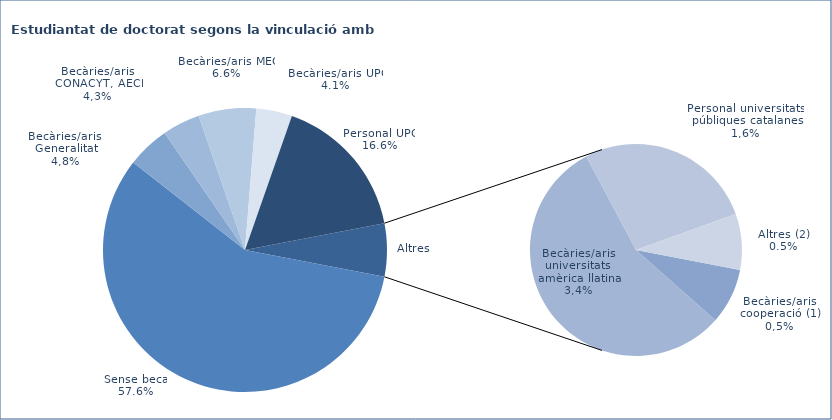
| Category | Series 0 | Series 1 |
|---|---|---|
| Sense beca | 1676 | 0.576 |
| Becàries/aris Generalitat | 141 | 0.048 |
| Becàries/aris CONACYT, AECI | 125 | 0.043 |
| Becàries/aris MEC | 191 | 0.066 |
| Becàries/aris UPC | 119 | 0.041 |
| Personal UPC | 484 | 0.166 |
| Becàries/aris cooperació (1) | 15 | 0.005 |
| Becàries/aris universitats amèrica llatina | 98 | 0.034 |
| Personal universitats públiques catalanes | 48 | 0.016 |
| Altres (2) | 15 | 0.005 |